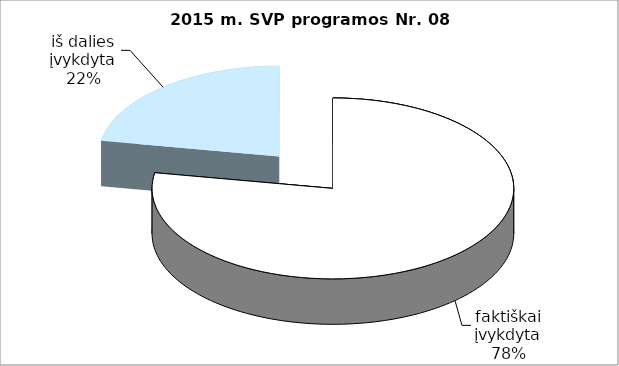
| Category | Series 0 |
|---|---|
| faktiškai įvykdyta | 7 |
| iš dalies įvykdyta | 2 |